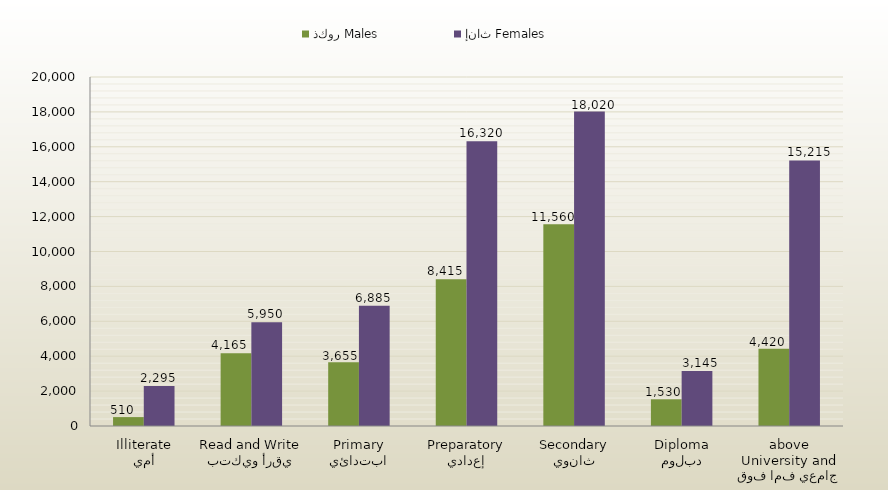
| Category | ذكور Males | إناث Females |
|---|---|---|
| أمي
Illiterate | 510 | 2295 |
| يقرأ ويكتب
Read and Write | 4165 | 5950 |
| ابتدائي
Primary | 3655 | 6885 |
| إعدادي
Preparatory | 8415 | 16320 |
| ثانوي
Secondary | 11560 | 18020 |
| دبلوم
Diploma | 1530 | 3145 |
| جامعي فما فوق
University and above | 4420 | 15215 |